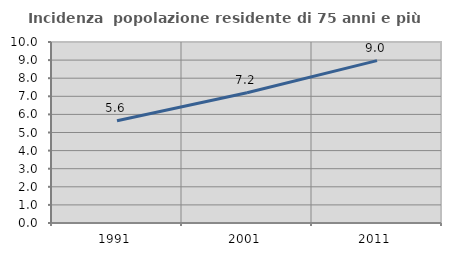
| Category | Incidenza  popolazione residente di 75 anni e più |
|---|---|
| 1991.0 | 5.648 |
| 2001.0 | 7.192 |
| 2011.0 | 8.972 |